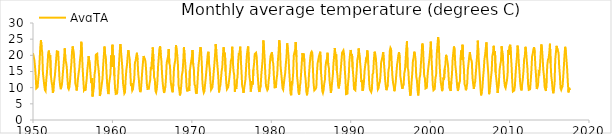
| Category | AvgTAvg |
|---|---|
| 1950.0 | 20.685 |
| 1950.0833333333333 | 20.688 |
| 1950.1666666666667 | 18.613 |
| 1950.25 | 16.6 |
| 1950.3333333333333 | 13.839 |
| 1950.4166666666667 | 9.792 |
| 1950.5 | 9.823 |
| 1950.5833333333333 | 10.185 |
| 1950.6666666666667 | 12.817 |
| 1950.75 | 14.484 |
| 1950.8333333333333 | 18.383 |
| 1950.9166666666667 | 22.492 |
| 1951.0 | 24.75 |
| 1951.0833333333333 | 22.366 |
| 1951.1666666666667 | 20.847 |
| 1951.25 | 14.475 |
| 1951.3333333333333 | 12.677 |
| 1951.4166666666667 | 10.733 |
| 1951.5 | 9.274 |
| 1951.5833333333333 | 8.952 |
| 1951.6666666666667 | 12.292 |
| 1951.75 | 14.444 |
| 1951.8333333333333 | 17.367 |
| 1951.9166666666667 | 20.774 |
| 1952.0 | 21.468 |
| 1952.0833333333333 | 19.336 |
| 1952.1666666666667 | 20.032 |
| 1952.25 | 13.817 |
| 1952.3333333333333 | 11.855 |
| 1952.4166666666667 | 10.708 |
| 1952.5 | 8.387 |
| 1952.5833333333333 | 9.274 |
| 1952.6666666666667 | 12.083 |
| 1952.75 | 13.565 |
| 1952.8333333333333 | 16.067 |
| 1952.9166666666667 | 18.75 |
| 1953.0 | 21.258 |
| 1953.0833333333333 | 21.321 |
| 1953.1666666666667 | 21.113 |
| 1953.25 | 17.15 |
| 1953.3333333333333 | 12.629 |
| 1953.4166666666667 | 10.625 |
| 1953.5 | 9.524 |
| 1953.5833333333333 | 9.306 |
| 1953.6666666666667 | 11.592 |
| 1953.75 | 14.169 |
| 1953.8333333333333 | 16.592 |
| 1953.9166666666667 | 19.306 |
| 1954.0 | 22.161 |
| 1954.0833333333333 | 18.643 |
| 1954.1666666666667 | 17.806 |
| 1954.25 | 16.408 |
| 1954.3333333333333 | 12.806 |
| 1954.4166666666667 | 9.95 |
| 1954.5 | 9.516 |
| 1954.5833333333333 | 10.226 |
| 1954.6666666666667 | 12.192 |
| 1954.75 | 15.105 |
| 1954.8333333333333 | 17.55 |
| 1954.9166666666667 | 21.194 |
| 1955.0 | 22.758 |
| 1955.0833333333333 | 22.857 |
| 1955.1666666666667 | 19.589 |
| 1955.25 | 15.8 |
| 1955.3333333333333 | 11.282 |
| 1955.4166666666667 | 10.5 |
| 1955.5 | 9.129 |
| 1955.5833333333333 | 10.79 |
| 1955.6666666666667 | 12.908 |
| 1955.75 | 14.597 |
| 1955.8333333333333 | 15.95 |
| 1955.9166666666667 | 18.581 |
| 1956.0 | 20.315 |
| 1956.0833333333333 | 24.207 |
| 1956.1666666666667 | 20.605 |
| 1956.25 | 16.008 |
| 1956.3333333333333 | 12.484 |
| 1956.4166666666667 | 9.208 |
| 1956.5 | 9.532 |
| 1956.5833333333333 | 9.04 |
| 1956.6666666666667 | 10.692 |
| 1956.75 | 12.452 |
| 1956.8333333333333 | 15.292 |
| 1956.9166666666667 | 17.29 |
| 1957.0 | 19.76 |
| 1957.0833333333333 | 19.745 |
| 1957.1666666666667 | 16.711 |
| 1957.25 | 14.027 |
| 1957.3333333333333 | 11.405 |
| 1957.4166666666667 | 12.99 |
| 1957.5 | 7.29 |
| 1957.5833333333333 | 8.865 |
| 1957.6666666666667 | 10.093 |
| 1957.75 | 14.082 |
| 1957.8333333333333 | 15.56 |
| 1957.9166666666667 | 20.182 |
| 1958.0 | 19.913 |
| 1958.0833333333333 | 20.488 |
| 1958.1666666666667 | 17.423 |
| 1958.25 | 15.803 |
| 1958.3333333333333 | 13.332 |
| 1958.4166666666667 | 7.437 |
| 1958.5 | 8.353 |
| 1958.5833333333333 | 9.69 |
| 1958.6666666666667 | 9.538 |
| 1958.75 | 12.758 |
| 1958.8333333333333 | 16.818 |
| 1958.9166666666667 | 16.976 |
| 1959.0 | 22.711 |
| 1959.0833333333333 | 20.311 |
| 1959.1666666666667 | 19.479 |
| 1959.25 | 14.993 |
| 1959.3333333333333 | 11.206 |
| 1959.4166666666667 | 9.055 |
| 1959.5 | 8.008 |
| 1959.5833333333333 | 11.255 |
| 1959.6666666666667 | 11.277 |
| 1959.75 | 14.148 |
| 1959.8333333333333 | 19.98 |
| 1959.9166666666667 | 16.373 |
| 1960.0 | 23.277 |
| 1960.0833333333333 | 18.726 |
| 1960.1666666666667 | 19.929 |
| 1960.25 | 13.512 |
| 1960.3333333333333 | 9.766 |
| 1960.4166666666667 | 8.06 |
| 1960.5 | 8.039 |
| 1960.5833333333333 | 8.176 |
| 1960.6666666666667 | 10.293 |
| 1960.75 | 14.103 |
| 1960.8333333333333 | 14.042 |
| 1960.9166666666667 | 21.092 |
| 1961.0 | 23.465 |
| 1961.0833333333333 | 21.111 |
| 1961.1666666666667 | 18.803 |
| 1961.25 | 16.057 |
| 1961.3333333333333 | 11.46 |
| 1961.4166666666667 | 9.785 |
| 1961.5 | 8.21 |
| 1961.5833333333333 | 8.565 |
| 1961.6666666666667 | 12.573 |
| 1961.75 | 15.518 |
| 1961.8333333333333 | 16.982 |
| 1961.9166666666667 | 19.621 |
| 1962.0 | 21.595 |
| 1962.0833333333333 | 20.164 |
| 1962.1666666666667 | 18.931 |
| 1962.25 | 15.113 |
| 1962.3333333333333 | 10.481 |
| 1962.4166666666667 | 11.355 |
| 1962.5 | 9.152 |
| 1962.5833333333333 | 9.555 |
| 1962.6666666666667 | 11.337 |
| 1962.75 | 12.823 |
| 1962.8333333333333 | 17.815 |
| 1962.9166666666667 | 18.21 |
| 1963.0 | 19.723 |
| 1963.0833333333333 | 20.788 |
| 1963.1666666666667 | 18.531 |
| 1963.25 | 14.215 |
| 1963.3333333333333 | 12.323 |
| 1963.4166666666667 | 9.64 |
| 1963.5 | 8.619 |
| 1963.5833333333333 | 9.311 |
| 1963.6666666666667 | 11.848 |
| 1963.75 | 15.026 |
| 1963.8333333333333 | 17.478 |
| 1963.9166666666667 | 19.777 |
| 1964.0 | 19.258 |
| 1964.0833333333333 | 18.929 |
| 1964.1666666666667 | 17.923 |
| 1964.25 | 15.075 |
| 1964.3333333333333 | 11.202 |
| 1964.4166666666667 | 9.612 |
| 1964.5 | 9.56 |
| 1964.5833333333333 | 9.655 |
| 1964.6666666666667 | 11.275 |
| 1964.75 | 12.298 |
| 1964.8333333333333 | 16.363 |
| 1964.9166666666667 | 15.716 |
| 1965.0 | 19.481 |
| 1965.0833333333333 | 22.455 |
| 1965.1666666666667 | 18.24 |
| 1965.25 | 13.14 |
| 1965.3333333333333 | 12.56 |
| 1965.4166666666667 | 9.025 |
| 1965.5 | 8.51 |
| 1965.5833333333333 | 9.508 |
| 1965.6666666666667 | 12.062 |
| 1965.75 | 16.563 |
| 1965.8333333333333 | 16.557 |
| 1965.9166666666667 | 22.048 |
| 1966.0 | 22.771 |
| 1966.0833333333333 | 20.255 |
| 1966.1666666666667 | 18.29 |
| 1966.25 | 14.255 |
| 1966.3333333333333 | 11.369 |
| 1966.4166666666667 | 9.582 |
| 1966.5 | 8.358 |
| 1966.5833333333333 | 8.297 |
| 1966.6666666666667 | 10.365 |
| 1966.75 | 13.277 |
| 1966.8333333333333 | 17.718 |
| 1966.9166666666667 | 17.837 |
| 1967.0 | 19.668 |
| 1967.0833333333333 | 21.973 |
| 1967.1666666666667 | 17.577 |
| 1967.25 | 16.687 |
| 1967.3333333333333 | 11.956 |
| 1967.4166666666667 | 10.585 |
| 1967.5 | 9.156 |
| 1967.5833333333333 | 8.568 |
| 1967.6666666666667 | 11.222 |
| 1967.75 | 16.031 |
| 1967.8333333333333 | 17.47 |
| 1967.9166666666667 | 18.473 |
| 1968.0 | 23.173 |
| 1968.0833333333333 | 23.383 |
| 1968.1666666666667 | 19.86 |
| 1968.25 | 16.988 |
| 1968.3333333333333 | 10.703 |
| 1968.4166666666667 | 9.343 |
| 1968.5 | 7.615 |
| 1968.5833333333333 | 8.66 |
| 1968.6666666666667 | 10.628 |
| 1968.75 | 14.013 |
| 1968.8333333333333 | 14.932 |
| 1968.9166666666667 | 18.026 |
| 1969.0 | 22.5 |
| 1969.0833333333333 | 19.852 |
| 1969.1666666666667 | 17.534 |
| 1969.25 | 14.582 |
| 1969.3333333333333 | 10.215 |
| 1969.4166666666667 | 8.858 |
| 1969.5 | 9.616 |
| 1969.5833333333333 | 9.926 |
| 1969.6666666666667 | 8.943 |
| 1969.75 | 15.235 |
| 1969.8333333333333 | 16.85 |
| 1969.9166666666667 | 16.737 |
| 1970.0 | 19.456 |
| 1970.0833333333333 | 21.654 |
| 1970.1666666666667 | 17.148 |
| 1970.25 | 15.873 |
| 1970.3333333333333 | 11.019 |
| 1970.4166666666667 | 10.573 |
| 1970.5 | 8.618 |
| 1970.5833333333333 | 8.081 |
| 1970.6666666666667 | 9.877 |
| 1970.75 | 13.211 |
| 1970.8333333333333 | 16.933 |
| 1970.9166666666667 | 18.579 |
| 1971.0 | 20.785 |
| 1971.0833333333333 | 22.568 |
| 1971.1666666666667 | 21.192 |
| 1971.25 | 17.573 |
| 1971.3333333333333 | 11.616 |
| 1971.4166666666667 | 9.445 |
| 1971.5 | 8.471 |
| 1971.5833333333333 | 8.937 |
| 1971.6666666666667 | 11.082 |
| 1971.75 | 12.982 |
| 1971.8333333333333 | 15.457 |
| 1971.9166666666667 | 17.968 |
| 1972.0 | 20.329 |
| 1972.0833333333333 | 21.105 |
| 1972.1666666666667 | 17.297 |
| 1972.25 | 15.722 |
| 1972.3333333333333 | 12.174 |
| 1972.4166666666667 | 9.35 |
| 1972.5 | 9.45 |
| 1972.5833333333333 | 10.076 |
| 1972.6666666666667 | 12.085 |
| 1972.75 | 14.815 |
| 1972.8333333333333 | 17.272 |
| 1972.9166666666667 | 19.987 |
| 1973.0 | 23.518 |
| 1973.0833333333333 | 21.177 |
| 1973.1666666666667 | 18.361 |
| 1973.25 | 15.875 |
| 1973.3333333333333 | 13.008 |
| 1973.4166666666667 | 8.54 |
| 1973.5 | 10.039 |
| 1973.5833333333333 | 10.582 |
| 1973.6666666666667 | 12.752 |
| 1973.75 | 15.142 |
| 1973.8333333333333 | 16.393 |
| 1973.9166666666667 | 20.227 |
| 1974.0 | 22.49 |
| 1974.0833333333333 | 19.655 |
| 1974.1666666666667 | 20.806 |
| 1974.25 | 15.025 |
| 1974.3333333333333 | 11.421 |
| 1974.4166666666667 | 9.507 |
| 1974.5 | 9.579 |
| 1974.5833333333333 | 10.213 |
| 1974.6666666666667 | 10.417 |
| 1974.75 | 13.618 |
| 1974.8333333333333 | 15.632 |
| 1974.9166666666667 | 18.418 |
| 1975.0 | 18.806 |
| 1975.0833333333333 | 22.654 |
| 1975.1666666666667 | 17.75 |
| 1975.25 | 15.047 |
| 1975.3333333333333 | 13.887 |
| 1975.4166666666667 | 8.738 |
| 1975.5 | 10.866 |
| 1975.5833333333333 | 9.639 |
| 1975.6666666666667 | 12.235 |
| 1975.75 | 13.237 |
| 1975.8333333333333 | 18.073 |
| 1975.9166666666667 | 20.75 |
| 1976.0 | 20.108 |
| 1976.0833333333333 | 22.662 |
| 1976.1666666666667 | 18.584 |
| 1976.25 | 14.885 |
| 1976.3333333333333 | 10.531 |
| 1976.4166666666667 | 9.828 |
| 1976.5 | 8.403 |
| 1976.5833333333333 | 9.835 |
| 1976.6666666666667 | 11.135 |
| 1976.75 | 12.585 |
| 1976.8333333333333 | 16.385 |
| 1976.9166666666667 | 19.687 |
| 1977.0 | 21.671 |
| 1977.0833333333333 | 22.757 |
| 1977.1666666666667 | 18.376 |
| 1977.25 | 13.473 |
| 1977.3333333333333 | 12.055 |
| 1977.4166666666667 | 8.787 |
| 1977.5 | 8.571 |
| 1977.5833333333333 | 11.974 |
| 1977.6666666666667 | 10.98 |
| 1977.75 | 15.661 |
| 1977.8333333333333 | 17.415 |
| 1977.9166666666667 | 20.403 |
| 1978.0 | 20.305 |
| 1978.0833333333333 | 20.8 |
| 1978.1666666666667 | 19.4 |
| 1978.25 | 15.412 |
| 1978.3333333333333 | 12.36 |
| 1978.4166666666667 | 9.512 |
| 1978.5 | 8.658 |
| 1978.5833333333333 | 8.503 |
| 1978.6666666666667 | 10.757 |
| 1978.75 | 14.174 |
| 1978.8333333333333 | 16.51 |
| 1978.9166666666667 | 18.968 |
| 1979.0 | 24.613 |
| 1979.0833333333333 | 22.186 |
| 1979.1666666666667 | 18.919 |
| 1979.25 | 14.17 |
| 1979.3333333333333 | 10.545 |
| 1979.4166666666667 | 10.68 |
| 1979.5 | 9.218 |
| 1979.5833333333333 | 9.55 |
| 1979.6666666666667 | 12.157 |
| 1979.75 | 13.768 |
| 1979.8333333333333 | 17.882 |
| 1979.9166666666667 | 19.782 |
| 1980.0 | 19.548 |
| 1980.0833333333333 | 21 |
| 1980.1666666666667 | 18.369 |
| 1980.25 | 17.422 |
| 1980.3333333333333 | 13.327 |
| 1980.4166666666667 | 10.075 |
| 1980.5 | 9.966 |
| 1980.5833333333333 | 10.161 |
| 1980.6666666666667 | 12.663 |
| 1980.75 | 14.126 |
| 1980.8333333333333 | 18.433 |
| 1980.9166666666667 | 20.863 |
| 1981.0 | 24.677 |
| 1981.0833333333333 | 23.088 |
| 1981.1666666666667 | 16.782 |
| 1981.25 | 16.497 |
| 1981.3333333333333 | 12.269 |
| 1981.4166666666667 | 9.815 |
| 1981.5 | 9.405 |
| 1981.5833333333333 | 9.608 |
| 1981.6666666666667 | 13.035 |
| 1981.75 | 14.495 |
| 1981.8333333333333 | 17.395 |
| 1981.9166666666667 | 19.516 |
| 1982.0 | 23.716 |
| 1982.0833333333333 | 21.825 |
| 1982.1666666666667 | 19.79 |
| 1982.25 | 15.402 |
| 1982.3333333333333 | 12.087 |
| 1982.4166666666667 | 8.343 |
| 1982.5 | 7.653 |
| 1982.5833333333333 | 11.974 |
| 1982.6666666666667 | 11.567 |
| 1982.75 | 14.265 |
| 1982.8333333333333 | 19.988 |
| 1982.9166666666667 | 20.839 |
| 1983.0 | 20.411 |
| 1983.0833333333333 | 24.136 |
| 1983.1666666666667 | 19.532 |
| 1983.25 | 13.455 |
| 1983.3333333333333 | 11.482 |
| 1983.4166666666667 | 8.658 |
| 1983.5 | 7.85 |
| 1983.5833333333333 | 10.232 |
| 1983.6666666666667 | 11.41 |
| 1983.75 | 14.235 |
| 1983.8333333333333 | 17.362 |
| 1983.9166666666667 | 20.682 |
| 1984.0 | 19.979 |
| 1984.0833333333333 | 20.528 |
| 1984.1666666666667 | 18.039 |
| 1984.25 | 14.08 |
| 1984.3333333333333 | 12.239 |
| 1984.4166666666667 | 8.788 |
| 1984.5 | 7.645 |
| 1984.5833333333333 | 9.758 |
| 1984.6666666666667 | 10.112 |
| 1984.75 | 14.169 |
| 1984.8333333333333 | 17.102 |
| 1984.9166666666667 | 19.476 |
| 1985.0 | 20.81 |
| 1985.0833333333333 | 21.139 |
| 1985.1666666666667 | 20.721 |
| 1985.25 | 15.337 |
| 1985.3333333333333 | 11.161 |
| 1985.4166666666667 | 9.162 |
| 1985.5 | 9.031 |
| 1985.5833333333333 | 9.623 |
| 1985.6666666666667 | 10.038 |
| 1985.75 | 14.665 |
| 1985.8333333333333 | 17.528 |
| 1985.9166666666667 | 17.269 |
| 1986.0 | 19.692 |
| 1986.0833333333333 | 19.804 |
| 1986.1666666666667 | 21.135 |
| 1986.25 | 14.945 |
| 1986.3333333333333 | 12.521 |
| 1986.4166666666667 | 8.99 |
| 1986.5 | 8.371 |
| 1986.5833333333333 | 9.242 |
| 1986.6666666666667 | 11.222 |
| 1986.75 | 12.41 |
| 1986.8333333333333 | 16.617 |
| 1986.9166666666667 | 18.256 |
| 1987.0 | 18.784 |
| 1987.0833333333333 | 20.809 |
| 1987.1666666666667 | 17.16 |
| 1987.25 | 16.152 |
| 1987.3333333333333 | 12.318 |
| 1987.4166666666667 | 10.285 |
| 1987.5 | 8.389 |
| 1987.5833333333333 | 9.719 |
| 1987.6666666666667 | 11.885 |
| 1987.75 | 13.839 |
| 1987.8333333333333 | 17.542 |
| 1987.9166666666667 | 19.903 |
| 1988.0 | 22.255 |
| 1988.0833333333333 | 19.722 |
| 1988.1666666666667 | 20.335 |
| 1988.25 | 15.347 |
| 1988.3333333333333 | 13.613 |
| 1988.4166666666667 | 10.59 |
| 1988.5 | 9.771 |
| 1988.5833333333333 | 10.002 |
| 1988.6666666666667 | 12.905 |
| 1988.75 | 15.681 |
| 1988.8333333333333 | 15.738 |
| 1988.9166666666667 | 20.824 |
| 1989.0 | 20.877 |
| 1989.0833333333333 | 21.527 |
| 1989.1666666666667 | 20.266 |
| 1989.25 | 15.823 |
| 1989.3333333333333 | 12.587 |
| 1989.4166666666667 | 8.002 |
| 1989.5 | 8.048 |
| 1989.5833333333333 | 8.148 |
| 1989.6666666666667 | 11.432 |
| 1989.75 | 13.418 |
| 1989.8333333333333 | 18.145 |
| 1989.9166666666667 | 20.411 |
| 1990.0 | 21.656 |
| 1990.0833333333333 | 19.87 |
| 1990.1666666666667 | 20.394 |
| 1990.25 | 15.828 |
| 1990.3333333333333 | 13.395 |
| 1990.4166666666667 | 9.585 |
| 1990.5 | 9.482 |
| 1990.5833333333333 | 9.202 |
| 1990.6666666666667 | 12.34 |
| 1990.75 | 15.173 |
| 1990.8333333333333 | 18.623 |
| 1990.9166666666667 | 19.589 |
| 1991.0 | 22.142 |
| 1991.0833333333333 | 21.855 |
| 1991.1666666666667 | 18.265 |
| 1991.25 | 15.89 |
| 1991.3333333333333 | 11.723 |
| 1991.4166666666667 | 12.252 |
| 1991.5 | 9.065 |
| 1991.5833333333333 | 9.676 |
| 1991.6666666666667 | 11.893 |
| 1991.75 | 15.306 |
| 1991.8333333333333 | 17.078 |
| 1991.9166666666667 | 18.719 |
| 1992.0 | 18.394 |
| 1992.0833333333333 | 21.528 |
| 1992.1666666666667 | 19.785 |
| 1992.25 | 15.647 |
| 1992.3333333333333 | 11.165 |
| 1992.4166666666667 | 9.423 |
| 1992.5 | 9.339 |
| 1992.5833333333333 | 8.642 |
| 1992.6666666666667 | 9.53 |
| 1992.75 | 14.127 |
| 1992.8333333333333 | 14.553 |
| 1992.9166666666667 | 18.548 |
| 1993.0 | 21.115 |
| 1993.0833333333333 | 20.521 |
| 1993.1666666666667 | 19.111 |
| 1993.25 | 16.22 |
| 1993.3333333333333 | 12.758 |
| 1993.4166666666667 | 9.448 |
| 1993.5 | 9.785 |
| 1993.5833333333333 | 11.176 |
| 1993.6666666666667 | 11.723 |
| 1993.75 | 13.852 |
| 1993.8333333333333 | 17.907 |
| 1993.9166666666667 | 18.676 |
| 1994.0 | 19.615 |
| 1994.0833333333333 | 20.991 |
| 1994.1666666666667 | 18.339 |
| 1994.25 | 15.525 |
| 1994.3333333333333 | 12.389 |
| 1994.4166666666667 | 10.437 |
| 1994.5 | 9.218 |
| 1994.5833333333333 | 8.982 |
| 1994.6666666666667 | 10.923 |
| 1994.75 | 15.365 |
| 1994.8333333333333 | 16.323 |
| 1994.9166666666667 | 21.26 |
| 1995.0 | 22.292 |
| 1995.0833333333333 | 21.88 |
| 1995.1666666666667 | 17.356 |
| 1995.25 | 13.522 |
| 1995.3333333333333 | 11.498 |
| 1995.4166666666667 | 10.433 |
| 1995.5 | 8.905 |
| 1995.5833333333333 | 10.223 |
| 1995.6666666666667 | 11.843 |
| 1995.75 | 14.416 |
| 1995.8333333333333 | 17.023 |
| 1995.9166666666667 | 18.394 |
| 1996.0 | 20.071 |
| 1996.0833333333333 | 21.005 |
| 1996.1666666666667 | 19.182 |
| 1996.25 | 13.485 |
| 1996.3333333333333 | 12.139 |
| 1996.4166666666667 | 10.618 |
| 1996.5 | 9.644 |
| 1996.5833333333333 | 9.869 |
| 1996.6666666666667 | 11.21 |
| 1996.75 | 14.463 |
| 1996.8333333333333 | 15.523 |
| 1996.9166666666667 | 18.637 |
| 1997.0 | 22.081 |
| 1997.0833333333333 | 24.357 |
| 1997.1666666666667 | 16.144 |
| 1997.25 | 15.448 |
| 1997.3333333333333 | 11.737 |
| 1997.4166666666667 | 9.417 |
| 1997.5 | 7.506 |
| 1997.5833333333333 | 8.748 |
| 1997.6666666666667 | 11.837 |
| 1997.75 | 14.373 |
| 1997.8333333333333 | 18.362 |
| 1997.9166666666667 | 19.223 |
| 1998.0 | 21.119 |
| 1998.0833333333333 | 20.288 |
| 1998.1666666666667 | 18.724 |
| 1998.25 | 13.435 |
| 1998.3333333333333 | 12.302 |
| 1998.4166666666667 | 9.235 |
| 1998.5 | 7.602 |
| 1998.5833333333333 | 10.195 |
| 1998.6666666666667 | 12.995 |
| 1998.75 | 13.898 |
| 1998.8333333333333 | 17.245 |
| 1998.9166666666667 | 19.966 |
| 1999.0 | 23.655 |
| 1999.0833333333333 | 23.241 |
| 1999.1666666666667 | 18.468 |
| 1999.25 | 13.58 |
| 1999.3333333333333 | 13.044 |
| 1999.4166666666667 | 9.757 |
| 1999.5 | 9.718 |
| 1999.5833333333333 | 9.985 |
| 1999.6666666666667 | 13.5 |
| 1999.75 | 15.674 |
| 1999.8333333333333 | 15.658 |
| 1999.9166666666667 | 19.118 |
| 2000.0 | 21.532 |
| 2000.0833333333333 | 24.24 |
| 2000.1666666666667 | 19.239 |
| 2000.25 | 15.478 |
| 2000.3333333333333 | 10.823 |
| 2000.4166666666667 | 9.22 |
| 2000.5 | 9.208 |
| 2000.5833333333333 | 9.615 |
| 2000.6666666666667 | 13.005 |
| 2000.75 | 13.81 |
| 2000.8333333333333 | 20.387 |
| 2000.9166666666667 | 20.426 |
| 2001.0 | 25.652 |
| 2001.0833333333333 | 23.954 |
| 2001.1666666666667 | 18.448 |
| 2001.25 | 14.647 |
| 2001.3333333333333 | 11.76 |
| 2001.4166666666667 | 10.478 |
| 2001.5 | 8.927 |
| 2001.5833333333333 | 9.911 |
| 2001.6666666666667 | 13.127 |
| 2001.75 | 12.5 |
| 2001.8333333333333 | 15.888 |
| 2001.9166666666667 | 17.05 |
| 2002.0 | 20.15 |
| 2002.0833333333333 | 19.438 |
| 2002.1666666666667 | 18.181 |
| 2002.25 | 16.917 |
| 2002.3333333333333 | 12.974 |
| 2002.4166666666667 | 9.953 |
| 2002.5 | 9.648 |
| 2002.5833333333333 | 8.998 |
| 2002.6666666666667 | 11.917 |
| 2002.75 | 14.148 |
| 2002.8333333333333 | 18.737 |
| 2002.9166666666667 | 20.861 |
| 2003.0 | 22.737 |
| 2003.0833333333333 | 21.734 |
| 2003.1666666666667 | 17.103 |
| 2003.25 | 15.173 |
| 2003.3333333333333 | 12.632 |
| 2003.4166666666667 | 10.122 |
| 2003.5 | 8.968 |
| 2003.5833333333333 | 8.734 |
| 2003.6666666666667 | 11.527 |
| 2003.75 | 11.981 |
| 2003.8333333333333 | 19.16 |
| 2003.9166666666667 | 21.537 |
| 2004.0 | 18.577 |
| 2004.0833333333333 | 23.278 |
| 2004.1666666666667 | 18.758 |
| 2004.25 | 15.883 |
| 2004.3333333333333 | 11.068 |
| 2004.4166666666667 | 10.503 |
| 2004.5 | 9.206 |
| 2004.5833333333333 | 9.997 |
| 2004.6666666666667 | 11.33 |
| 2004.75 | 15.653 |
| 2004.8333333333333 | 17.473 |
| 2004.9166666666667 | 19.505 |
| 2005.0 | 20.984 |
| 2005.0833333333333 | 19.195 |
| 2005.1666666666667 | 18.669 |
| 2005.25 | 18.032 |
| 2005.3333333333333 | 13.089 |
| 2005.4166666666667 | 11.112 |
| 2005.5 | 9.606 |
| 2005.5833333333333 | 10.905 |
| 2005.6666666666667 | 11.848 |
| 2005.75 | 14.534 |
| 2005.8333333333333 | 17.368 |
| 2005.9166666666667 | 20.034 |
| 2006.0 | 24.545 |
| 2006.0833333333333 | 20.036 |
| 2006.1666666666667 | 20.021 |
| 2006.25 | 13.537 |
| 2006.3333333333333 | 9.963 |
| 2006.4166666666667 | 7.617 |
| 2006.5 | 8.74 |
| 2006.5833333333333 | 10.074 |
| 2006.6666666666667 | 13.133 |
| 2006.75 | 15.497 |
| 2006.8333333333333 | 18.748 |
| 2006.9166666666667 | 20.11 |
| 2007.0 | 22.119 |
| 2007.0833333333333 | 24 |
| 2007.1666666666667 | 19.394 |
| 2007.25 | 16.812 |
| 2007.3333333333333 | 13.747 |
| 2007.4166666666667 | 7.98 |
| 2007.5 | 9.044 |
| 2007.5833333333333 | 10.953 |
| 2007.6666666666667 | 13.293 |
| 2007.75 | 15.271 |
| 2007.8333333333333 | 19.827 |
| 2007.9166666666667 | 20.784 |
| 2008.0 | 22.94 |
| 2008.0833333333333 | 20.078 |
| 2008.1666666666667 | 21.253 |
| 2008.25 | 14.515 |
| 2008.3333333333333 | 12.65 |
| 2008.4166666666667 | 10.457 |
| 2008.5 | 8.353 |
| 2008.5833333333333 | 8.144 |
| 2008.6666666666667 | 12.23 |
| 2008.75 | 15.65 |
| 2008.8333333333333 | 17.077 |
| 2008.9166666666667 | 18.239 |
| 2009.0 | 22.805 |
| 2009.0833333333333 | 22.745 |
| 2009.1666666666667 | 19.155 |
| 2009.25 | 15.425 |
| 2009.3333333333333 | 12.024 |
| 2009.4166666666667 | 10.345 |
| 2009.5 | 9.894 |
| 2009.5833333333333 | 11.084 |
| 2009.6666666666667 | 12.19 |
| 2009.75 | 13.99 |
| 2009.8333333333333 | 21.68 |
| 2009.9166666666667 | 20.121 |
| 2010.0 | 22.74 |
| 2010.0833333333333 | 23.28 |
| 2010.1666666666667 | 20.092 |
| 2010.25 | 16.867 |
| 2010.3333333333333 | 12.047 |
| 2010.4166666666667 | 8.813 |
| 2010.5 | 8.553 |
| 2010.5833333333333 | 9.1 |
| 2010.6666666666667 | 10.368 |
| 2010.75 | 13.961 |
| 2010.8333333333333 | 17.005 |
| 2010.9166666666667 | 19.16 |
| 2011.0 | 23.005 |
| 2011.0833333333333 | 21.804 |
| 2011.1666666666667 | 17.524 |
| 2011.25 | 14.942 |
| 2011.3333333333333 | 11.568 |
| 2011.4166666666667 | 9.793 |
| 2011.5 | 9.152 |
| 2011.5833333333333 | 11.027 |
| 2011.6666666666667 | 12.633 |
| 2011.75 | 15.089 |
| 2011.8333333333333 | 18.768 |
| 2011.9166666666667 | 19.69 |
| 2012.0 | 22.631 |
| 2012.0833333333333 | 21.126 |
| 2012.1666666666667 | 18.41 |
| 2012.25 | 15.912 |
| 2012.3333333333333 | 11.002 |
| 2012.4166666666667 | 9.325 |
| 2012.5 | 9.076 |
| 2012.5833333333333 | 9.495 |
| 2012.6666666666667 | 12.267 |
| 2012.75 | 15.29 |
| 2012.8333333333333 | 19.603 |
| 2012.9166666666667 | 20.489 |
| 2013.0 | 21.797 |
| 2013.0833333333333 | 22.513 |
| 2013.1666666666667 | 20.829 |
| 2013.25 | 16.558 |
| 2013.3333333333333 | 13.719 |
| 2013.4166666666667 | 9.61 |
| 2013.5 | 10.034 |
| 2013.5833333333333 | 10.834 |
| 2013.6666666666667 | 14.745 |
| 2013.75 | 14.41 |
| 2013.8333333333333 | 16.887 |
| 2013.9166666666667 | 20.305 |
| 2014.0 | 23.368 |
| 2014.0833333333333 | 21.861 |
| 2014.1666666666667 | 18.956 |
| 2014.25 | 15.398 |
| 2014.3333333333333 | 13.565 |
| 2014.4166666666667 | 10.235 |
| 2014.5 | 9.458 |
| 2014.5833333333333 | 8.985 |
| 2014.6666666666667 | 12.905 |
| 2014.75 | 16.932 |
| 2014.8333333333333 | 18.728 |
| 2014.9166666666667 | 19.124 |
| 2015.0 | 20.827 |
| 2015.0833333333333 | 23.609 |
| 2015.1666666666667 | 17.584 |
| 2015.25 | 13.615 |
| 2015.3333333333333 | 11.921 |
| 2015.4166666666667 | 9.53 |
| 2015.5 | 8.273 |
| 2015.5833333333333 | 9.548 |
| 2015.6666666666667 | 11.247 |
| 2015.75 | 18.745 |
| 2015.8333333333333 | 18.708 |
| 2015.9166666666667 | 22.935 |
| 2016.0 | 22.961 |
| 2016.0833333333333 | 21.345 |
| 2016.1666666666667 | 20.798 |
| 2016.25 | 16.398 |
| 2016.3333333333333 | 13.774 |
| 2016.4166666666667 | 9.877 |
| 2016.5 | 9.324 |
| 2016.5833333333333 | 9.955 |
| 2016.6666666666667 | 10.407 |
| 2016.75 | 13.153 |
| 2016.8333333333333 | 16.345 |
| 2016.9166666666667 | 20.056 |
| 2017.0 | 22.634 |
| 2017.0833333333333 | 21.111 |
| 2017.1666666666667 | 21.171 |
| 2017.25 | 15.793 |
| 2017.3333333333333 | 11.685 |
| 2017.4166666666667 | 8.53 |
| 2017.5 | 9.947 |
| 2017.5833333333333 | 9.256 |